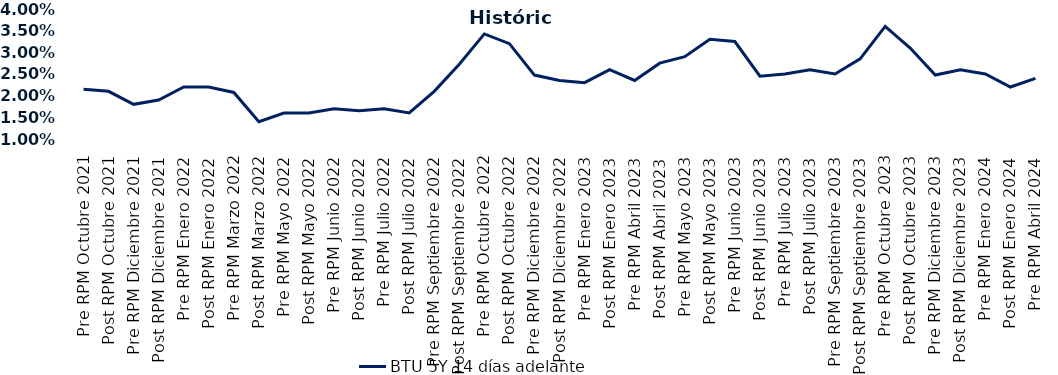
| Category | BTU 5Y 14 días adelante |
|---|---|
| Pre RPM Octubre 2021 | 0.022 |
| Post RPM Octubre 2021 | 0.021 |
| Pre RPM Diciembre 2021 | 0.018 |
| Post RPM Diciembre 2021 | 0.019 |
| Pre RPM Enero 2022 | 0.022 |
| Post RPM Enero 2022 | 0.022 |
| Pre RPM Marzo 2022 | 0.021 |
| Post RPM Marzo 2022 | 0.014 |
| Pre RPM Mayo 2022 | 0.016 |
| Post RPM Mayo 2022 | 0.016 |
| Pre RPM Junio 2022 | 0.017 |
| Post RPM Junio 2022 | 0.016 |
| Pre RPM Julio 2022 | 0.017 |
| Post RPM Julio 2022 | 0.016 |
| Pre RPM Septiembre 2022 | 0.021 |
| Post RPM Septiembre 2022 | 0.027 |
| Pre RPM Octubre 2022 | 0.034 |
| Post RPM Octubre 2022 | 0.032 |
| Pre RPM Diciembre 2022 | 0.025 |
| Post RPM Diciembre 2022 | 0.024 |
| Pre RPM Enero 2023 | 0.023 |
| Post RPM Enero 2023 | 0.026 |
| Pre RPM Abril 2023 | 0.024 |
| Post RPM Abril 2023 | 0.028 |
| Pre RPM Mayo 2023 | 0.029 |
| Post RPM Mayo 2023 | 0.033 |
| Pre RPM Junio 2023 | 0.032 |
| Post RPM Junio 2023 | 0.024 |
| Pre RPM Julio 2023 | 0.025 |
| Post RPM Julio 2023 | 0.026 |
| Pre RPM Septiembre 2023 | 0.025 |
| Post RPM Septiembre 2023 | 0.028 |
| Pre RPM Octubre 2023 | 0.036 |
| Post RPM Octubre 2023 | 0.031 |
| Pre RPM Diciembre 2023 | 0.025 |
| Post RPM Diciembre 2023 | 0.026 |
| Pre RPM Enero 2024 | 0.025 |
| Post RPM Enero 2024 | 0.022 |
| Pre RPM Abril 2024 | 0.024 |